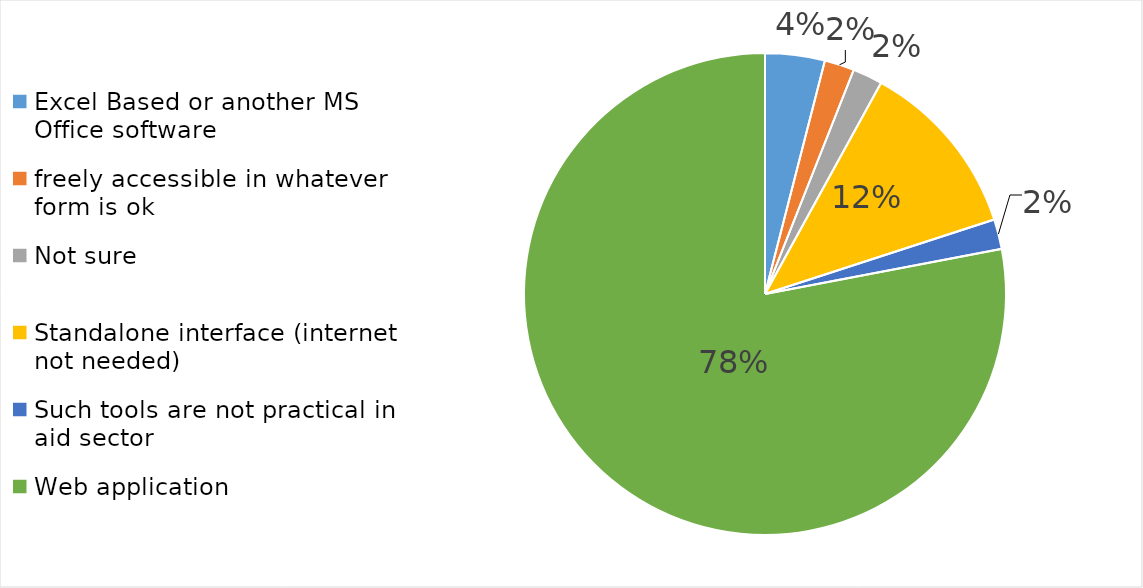
| Category | Count |
|---|---|
| Excel Based or another MS Office software | 2 |
| freely accessible in whatever form is ok | 1 |
| Not sure  | 1 |
| Standalone interface (internet not needed) | 6 |
| Such tools are not practical in aid sector | 1 |
| Web application | 39 |